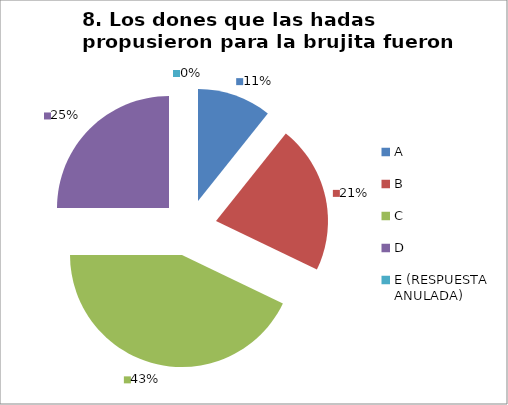
| Category | CANTIDAD DE RESPUESTAS PREGUNTA (8) | PORCENTAJE |
|---|---|---|
| A | 3 | 0.107 |
| B | 6 | 0.214 |
| C | 12 | 0.429 |
| D | 7 | 0.25 |
| E (RESPUESTA ANULADA) | 0 | 0 |